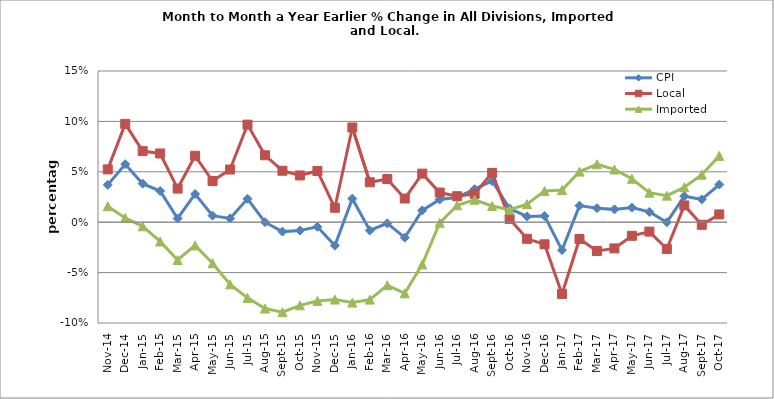
| Category | CPI | Local | Imported |
|---|---|---|---|
| 2014-11-02 | 0.037 | 0.052 | 0.016 |
| 2014-12-02 | 0.058 | 0.098 | 0.004 |
| 2015-01-02 | 0.038 | 0.071 | -0.004 |
| 2015-02-02 | 0.031 | 0.068 | -0.019 |
| 2015-03-02 | 0.004 | 0.033 | -0.037 |
| 2015-04-02 | 0.028 | 0.066 | -0.023 |
| 2015-05-01 | 0.007 | 0.041 | -0.041 |
| 2015-06-01 | 0.004 | 0.052 | -0.062 |
| 2015-07-01 | 0.023 | 0.097 | -0.075 |
| 2015-08-01 | 0 | 0.066 | -0.086 |
| 2015-09-01 | -0.009 | 0.051 | -0.089 |
| 2015-10-01 | -0.008 | 0.046 | -0.082 |
| 2015-11-01 | -0.005 | 0.051 | -0.078 |
| 2015-12-01 | -0.023 | 0.014 | -0.077 |
| 2016-01-01 | 0.023 | 0.094 | -0.08 |
| 2016-02-01 | -0.008 | 0.04 | -0.077 |
| 2016-03-01 | -0.001 | 0.043 | -0.063 |
| 2016-04-01 | -0.015 | 0.023 | -0.071 |
| 2016-05-01 | 0.012 | 0.048 | -0.042 |
| 2016-06-01 | 0.023 | 0.029 | -0.001 |
| 2016-07-01 | 0.025 | 0.026 | 0.017 |
| 2016-08-01 | 0.033 | 0.028 | 0.022 |
| 2016-09-01 | 0.041 | 0.049 | 0.016 |
| 2016-10-01 | 0.014 | 0.003 | 0.012 |
| 2016-11-01 | 0.006 | -0.016 | 0.018 |
| 2016-12-01 | 0.006 | -0.022 | 0.031 |
| 2017-01-01 | -0.028 | -0.071 | 0.032 |
| 2017-02-01 | 0.016 | -0.017 | 0.05 |
| 2017-03-01 | 0.014 | -0.029 | 0.057 |
| 2017-04-01 | 0.013 | -0.026 | 0.052 |
| 2017-05-01 | 0.015 | -0.013 | 0.043 |
| 2017-06-01 | 0.01 | -0.009 | 0.029 |
| 2017-07-01 | 0 | -0.027 | 0.026 |
| 2017-08-01 | 0.026 | 0.017 | 0.035 |
| 2017-09-01 | 0.023 | -0.003 | 0.047 |
| 2017-10-01 | 0.037 | 0.008 | 0.066 |